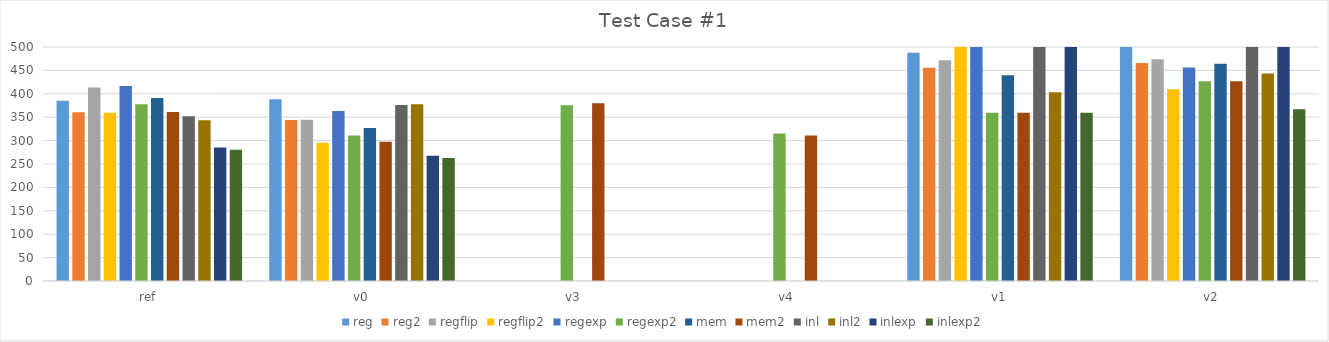
| Category | reg | reg2 | regflip | regflip2 | regexp | regexp2 | mem | mem2 | inl | inl2 | inlexp | inlexp2 |
|---|---|---|---|---|---|---|---|---|---|---|---|---|
| ref | 385.133 | 360.556 | 413.501 | 359.609 | 416.755 | 377.921 | 390.978 | 361.15 | 351.817 | 343.586 | 285.099 | 280.507 |
| v0 | 388.336 | 343.863 | 344.366 | 295.462 | 363.115 | 311.003 | 327.18 | 297.743 | 375.901 | 377.512 | 267.774 | 263.029 |
| v3 | 0 | 0 | 0 | 0 | 0 | 375.735 | 0 | 379.707 | 0 | 0 | 0 | 0 |
| v4 | 0 | 0 | 0 | 0 | 0 | 315.305 | 0 | 310.921 | 0 | 0 | 0 | 0 |
| v1 | 487.96 | 455.467 | 471.85 | 544.314 | 569.814 | 359.381 | 439.668 | 359.382 | 634.594 | 403.401 | 570.027 | 359.546 |
| v2 | 642.895 | 465.932 | 473.994 | 409.865 | 455.946 | 426.658 | 464.368 | 427.014 | 575.162 | 443.584 | 573.891 | 366.996 |